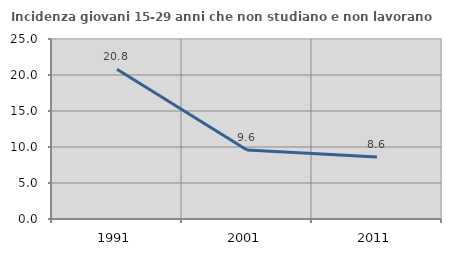
| Category | Incidenza giovani 15-29 anni che non studiano e non lavorano  |
|---|---|
| 1991.0 | 20.812 |
| 2001.0 | 9.596 |
| 2011.0 | 8.602 |